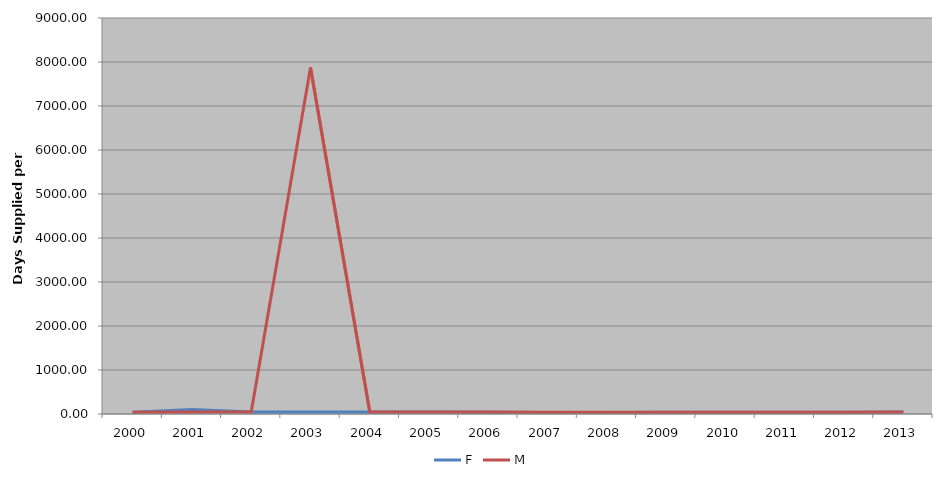
| Category | F | M |
|---|---|---|
| 2000 | 39.202 | 40.448 |
| 2001 | 100.251 | 43.135 |
| 2002 | 44.024 | 47.262 |
| 2003 | 45.585 | 7877.57 |
| 2004 | 44.854 | 47.388 |
| 2005 | 44.28 | 46.471 |
| 2006 | 41.598 | 42.671 |
| 2007 | 36.474 | 38.21 |
| 2008 | 36.386 | 37.766 |
| 2009 | 38.825 | 40.144 |
| 2010 | 38.806 | 39.912 |
| 2011 | 40.233 | 40.965 |
| 2012 | 41.584 | 42.102 |
| 2013 | 43.005 | 43.791 |